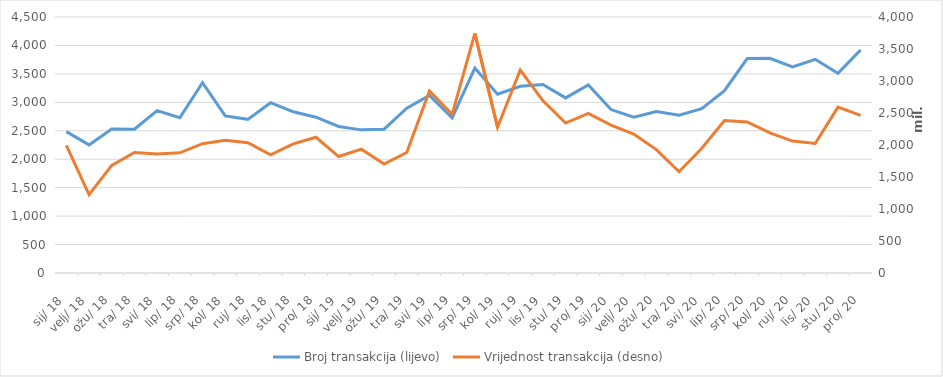
| Category | Broj transakcija (lijevo) |
|---|---|
| 2018-01-01 | 2485 |
| 2018-02-01 | 2252 |
| 2018-03-01 | 2531 |
| 2018-04-01 | 2529 |
| 2018-05-01 | 2854 |
| 2018-06-01 | 2730 |
| 2018-07-01 | 3346 |
| 2018-08-01 | 2762 |
| 2018-09-01 | 2701 |
| 2018-10-01 | 2993 |
| 2018-11-01 | 2834 |
| 2018-12-01 | 2739 |
| 2019-01-01 | 2575 |
| 2019-02-01 | 2516 |
| 2019-03-01 | 2528 |
| 2019-04-01 | 2897 |
| 2019-05-01 | 3123 |
| 2019-06-01 | 2727 |
| 2019-07-01 | 3602 |
| 2019-08-01 | 3142 |
| 2019-09-01 | 3282 |
| 2019-10-01 | 3314 |
| 2019-11-01 | 3078 |
| 2019-12-01 | 3306 |
| 2020-01-01 | 2873 |
| 2020-02-01 | 2738 |
| 2020-03-01 | 2838 |
| 2020-04-01 | 2774 |
| 2020-05-01 | 2888 |
| 2020-06-01 | 3205 |
| 2020-07-01 | 3770 |
| 2020-08-01 | 3773 |
| 2020-09-01 | 3621 |
| 2020-10-01 | 3756 |
| 2020-11-01 | 3510 |
| 2020-12-01 | 3922 |